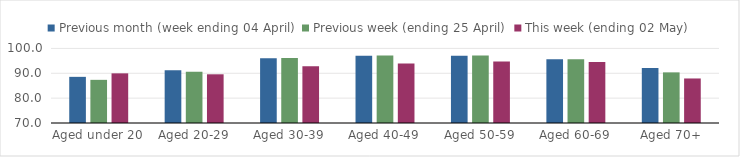
| Category | Previous month (week ending 04 April) | Previous week (ending 25 April) | This week (ending 02 May) |
|---|---|---|---|
| Aged under 20 | 88.566 | 87.362 | 89.974 |
| Aged 20-29 | 91.255 | 90.594 | 89.594 |
| Aged 30-39 | 96.041 | 96.188 | 92.868 |
| Aged 40-49 | 97.038 | 97.205 | 93.895 |
| Aged 50-59 | 97.039 | 97.182 | 94.699 |
| Aged 60-69 | 95.611 | 95.636 | 94.492 |
| Aged 70+ | 92.138 | 90.366 | 87.915 |